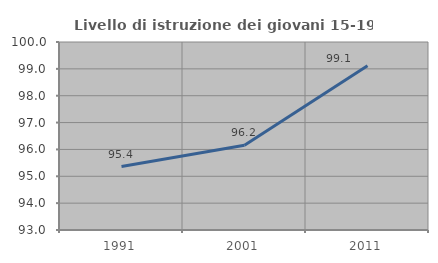
| Category | Livello di istruzione dei giovani 15-19 anni |
|---|---|
| 1991.0 | 95.361 |
| 2001.0 | 96.154 |
| 2011.0 | 99.119 |